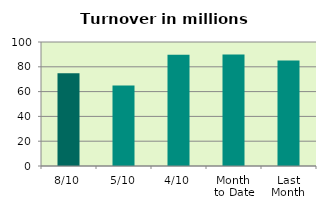
| Category | Series 0 |
|---|---|
| 8/10 | 74.717 |
| 5/10 | 64.919 |
| 4/10 | 89.735 |
| Month 
to Date | 89.849 |
| Last
Month | 85.072 |